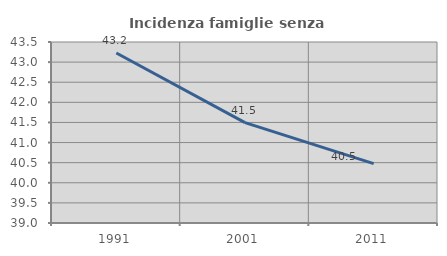
| Category | Incidenza famiglie senza nuclei |
|---|---|
| 1991.0 | 43.226 |
| 2001.0 | 41.497 |
| 2011.0 | 40.476 |